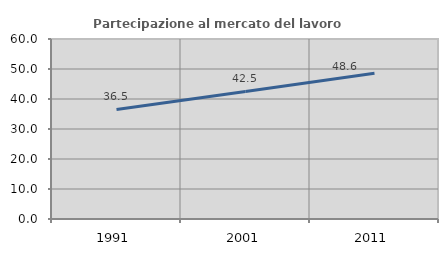
| Category | Partecipazione al mercato del lavoro  femminile |
|---|---|
| 1991.0 | 36.509 |
| 2001.0 | 42.512 |
| 2011.0 | 48.583 |